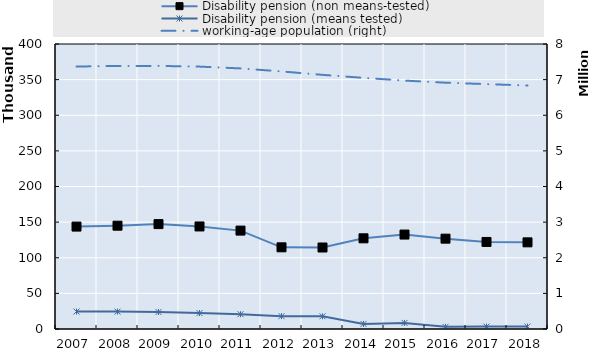
| Category | Disability pension (non means-tested) | Disability pension (means tested) |
|---|---|---|
| 2007.0 | 143731 | 24456 |
| 2008.0 | 144985 | 24413 |
| 2009.0 | 147230 | 23851 |
| 2010.0 | 143920 | 22348 |
| 2011.0 | 138093 | 20770 |
| 2012.0 | 114633 | 18004 |
| 2013.0 | 114376 | 17810 |
| 2014.0 | 127279 | 7113 |
| 2015.0 | 132562 | 8551 |
| 2016.0 | 126797 | 3003 |
| 2017.0 | 122178 | 3367 |
| 2018.0 | 121612 | 3393 |